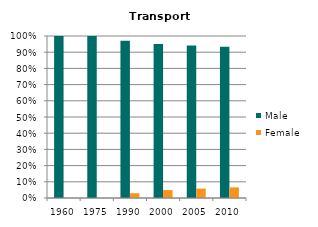
| Category | Male | Female |
|---|---|---|
| 1960.0 | 1 | 0 |
| 1975.0 | 1 | 0 |
| 1990.0 | 0.97 | 0.03 |
| 2000.0 | 0.951 | 0.049 |
| 2005.0 | 0.942 | 0.058 |
| 2010.0 | 0.934 | 0.066 |